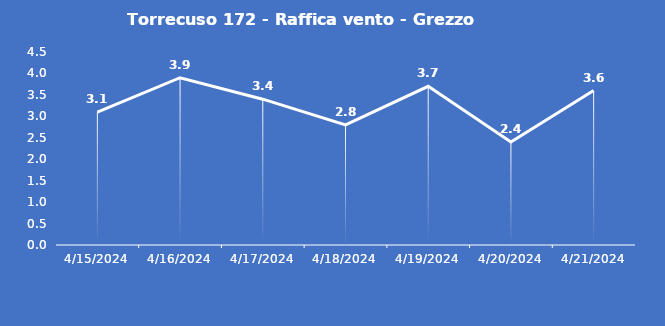
| Category | Torrecuso 172 - Raffica vento - Grezzo (m/s) |
|---|---|
| 4/15/24 | 3.1 |
| 4/16/24 | 3.9 |
| 4/17/24 | 3.4 |
| 4/18/24 | 2.8 |
| 4/19/24 | 3.7 |
| 4/20/24 | 2.4 |
| 4/21/24 | 3.6 |